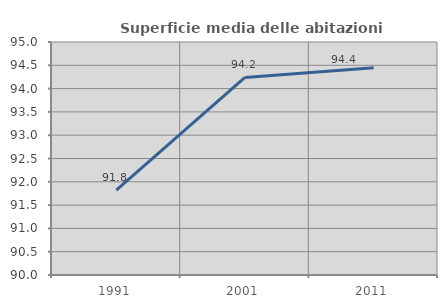
| Category | Superficie media delle abitazioni occupate |
|---|---|
| 1991.0 | 91.821 |
| 2001.0 | 94.24 |
| 2011.0 | 94.448 |